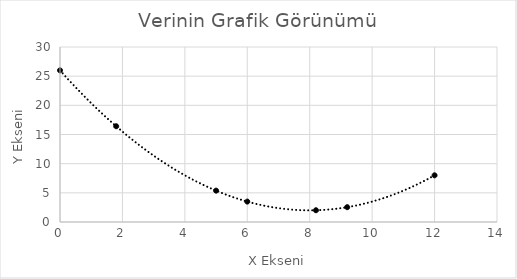
| Category | Series 0 |
|---|---|
| 0.0 | 26 |
| 1.8 | 16.415 |
| 5.0 | 5.375 |
| 6.0 | 3.5 |
| 8.2 | 2.015 |
| 9.2 | 2.54 |
| 12.0 | 8 |